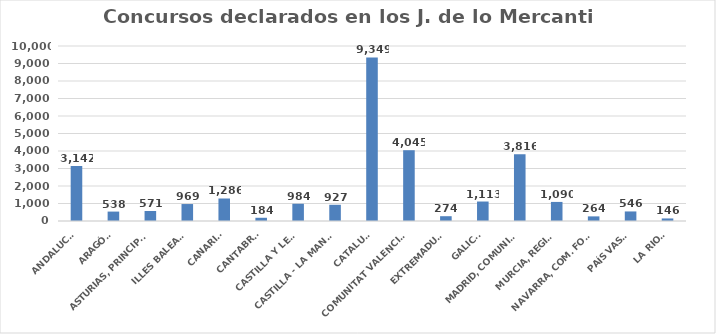
| Category | Series 0 |
|---|---|
| ANDALUCÍA | 3142 |
| ARAGÓN | 538 |
| ASTURIAS, PRINCIPADO | 571 |
| ILLES BALEARS | 969 |
| CANARIAS | 1286 |
| CANTABRIA | 184 |
| CASTILLA Y LEÓN | 984 |
| CASTILLA - LA MANCHA | 927 |
| CATALUÑA | 9349 |
| COMUNITAT VALENCIANA | 4045 |
| EXTREMADURA | 274 |
| GALICIA | 1113 |
| MADRID, COMUNIDAD | 3816 |
| MURCIA, REGIÓN | 1090 |
| NAVARRA, COM. FORAL | 264 |
| PAÍS VASCO | 546 |
| LA RIOJA | 146 |